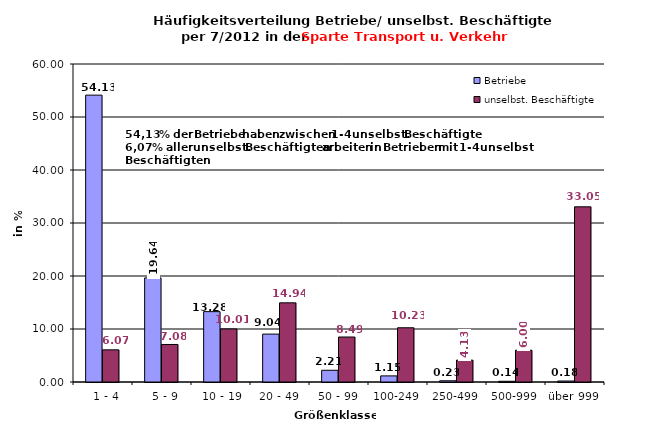
| Category | Betriebe | unselbst. Beschäftigte |
|---|---|---|
|   1 - 4 | 54.126 | 6.068 |
|   5 - 9 | 19.64 | 7.081 |
|  10 - 19 | 13.278 | 10.013 |
| 20 - 49 | 9.036 | 14.937 |
| 50 - 99 | 2.213 | 8.49 |
| 100-249 | 1.153 | 10.233 |
| 250-499 | 0.231 | 4.129 |
| 500-999 | 0.138 | 5.998 |
| über 999 | 0.184 | 33.051 |